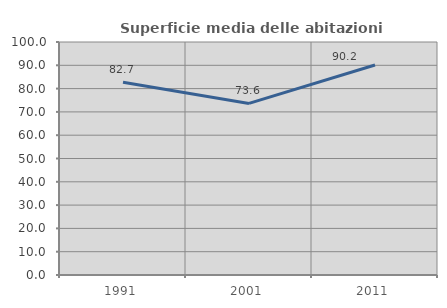
| Category | Superficie media delle abitazioni occupate |
|---|---|
| 1991.0 | 82.696 |
| 2001.0 | 73.649 |
| 2011.0 | 90.151 |